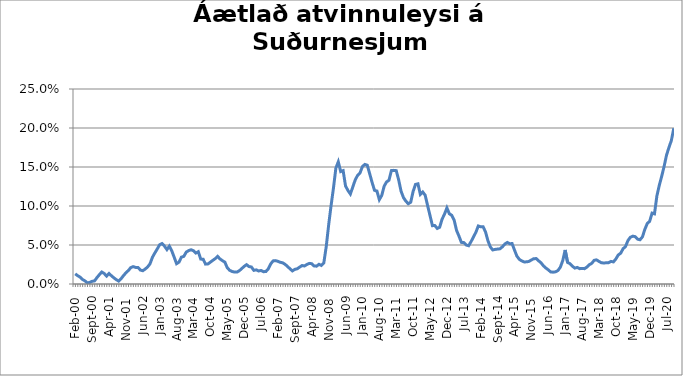
| Category | Series 0 |
|---|---|
| feb.00 | 0.013 |
| mar.00 | 0.011 |
| apr.00 | 0.009 |
| maí.00 | 0.006 |
| jún.00 | 0.004 |
| júl.00 | 0.002 |
| ágú.00 | 0.002 |
| sep.00 | 0.003 |
| okt.00 | 0.004 |
| nóv.00 | 0.008 |
| des.00 | 0.012 |
| jan.01 | 0.015 |
| feb.01 | 0.013 |
| mar.01 | 0.01 |
| apr.01 | 0.013 |
| maí.01 | 0.011 |
| jún.01 | 0.008 |
| júl.01 | 0.006 |
| ágú.01 | 0.004 |
| sep.01 | 0.007 |
| okt.01 | 0.011 |
| nóv.01 | 0.014 |
| des.01 | 0.017 |
| jan.02 | 0.021 |
| feb.02 | 0.022 |
| mar.02 | 0.021 |
| apr.02 | 0.021 |
| maí.02 | 0.018 |
| jún.02 | 0.017 |
| júl.02 | 0.019 |
| ágú.02 | 0.022 |
| sep.02 | 0.026 |
| okt.02 | 0.034 |
| nóv.02 | 0.04 |
| des.02 | 0.045 |
| jan.03 | 0.05 |
| feb.03 | 0.052 |
| mar.03 | 0.049 |
| apr.03 | 0.044 |
| maí.03 | 0.049 |
| jún.03 | 0.043 |
| júl.03 | 0.034 |
| ágú.03 | 0.026 |
| sep.03 | 0.028 |
| okt.03 | 0.034 |
| nóv.03 | 0.035 |
| des.03 | 0.041 |
| jan.04 | 0.043 |
| feb.04 | 0.044 |
| mar.04 | 0.043 |
| apr.04 | 0.04 |
| maí.04 | 0.041 |
| jún.04 | 0.032 |
| júl.04 | 0.032 |
| ágú.04 | 0.026 |
| sep.04 | 0.026 |
| okt.04 | 0.028 |
| nóv.04 | 0.03 |
| des.04 | 0.032 |
| jan.05 | 0.035 |
| feb.05 | 0.032 |
| mar.05 | 0.03 |
| apr.05 | 0.028 |
| maí.05 | 0.021 |
| jún.05 | 0.018 |
| júl.05 | 0.016 |
| ágú.05 | 0.015 |
| sep.05 | 0.015 |
| okt.05 | 0.017 |
| nóv.05 | 0.02 |
| des.05 | 0.023 |
| jan.06 | 0.025 |
| feb.06 | 0.022 |
| mar.06 | 0.022 |
| apr.06 | 0.018 |
| maí.06 | 0.018 |
| jún.06 | 0.017 |
| júl.06 | 0.017 |
| ágú.06 | 0.016 |
| sep.06 | 0.016 |
| okt.06 | 0.019 |
| nóv.06 | 0.026 |
| des.06 | 0.03 |
| jan.07 | 0.03 |
| feb.07 | 0.029 |
| mar.07 | 0.028 |
| apr.07 | 0.027 |
| maí.07 | 0.025 |
| jún.07 | 0.022 |
| júl.07 | 0.019 |
| ágú.07 | 0.017 |
| sep.07 | 0.019 |
| okt.07 | 0.02 |
| nóv.07 | 0.022 |
| des.07 | 0.024 |
| jan.08 | 0.023 |
| feb.08 | 0.025 |
| mar.08 | 0.026 |
| apr.08 | 0.026 |
| maí.08 | 0.023 |
| jún.08 | 0.023 |
| júl.08 | 0.025 |
| ágú.08 | 0.024 |
| sep.08 | 0.027 |
| okt.08 | 0.048 |
| nóv.08 | 0.075 |
| des.08 | 0.1 |
| jan.09 | 0.123 |
| feb.09 | 0.149 |
| mar.09 | 0.157 |
| apr.09 | 0.144 |
| maí.09 | 0.145 |
| jún.09 | 0.126 |
| júl.09 | 0.12 |
| ágú.09 | 0.115 |
| sep.09 | 0.124 |
| okt.09 | 0.133 |
| nóv.09 | 0.139 |
| des.09 | 0.142 |
| jan.10 | 0.151 |
| feb.10 | 0.153 |
| mar.10 | 0.152 |
| apr.10 | 0.141 |
| maí.10 | 0.13 |
| jún.10 | 0.12 |
| júl.10 | 0.119 |
| ágú.10 | 0.108 |
| sep.10 | 0.114 |
| okt.10 | 0.125 |
| nóv.10 | 0.131 |
| des.10 | 0.133 |
| jan.11 | 0.145 |
| feb.11 | 0.146 |
| mar.11 | 0.145 |
| apr.11 | 0.134 |
| maí.11 | 0.119 |
| jún.11 | 0.111 |
| júl.11 | 0.106 |
| ágú.11 | 0.103 |
| sep.11 | 0.105 |
| okt.11 | 0.119 |
| nóv.11 | 0.128 |
| des.11 | 0.128 |
| jan.12 | 0.115 |
| feb.12 | 0.118 |
| mar.12 | 0.114 |
| apr.12 | 0.101 |
| maí.12 | 0.088 |
| jún.12 | 0.075 |
| júl.12 | 0.075 |
| ágú.12 | 0.071 |
| sep.12 | 0.073 |
| okt.12 | 0.083 |
| nóv.12 | 0.09 |
| des.12 | 0.098 |
| jan.13 | 0.09 |
| feb.13 | 0.088 |
| mar.13 | 0.082 |
| apr.13 | 0.069 |
| maí.13 | 0.061 |
| jún.13 | 0.053 |
| júl.13 | 0.053 |
| ágú.13 | 0.05 |
| sep.13 | 0.049 |
| okt.13 | 0.054 |
| nóv.13 | 0.06 |
| des.13 | 0.066 |
| jan.14 | 0.074 |
| feb.14 | 0.073 |
| mar.14 | 0.073 |
| apr.14 | 0.067 |
| maí.14 | 0.055 |
| jún.14 | 0.048 |
| júl.14 | 0.044 |
| ágú.14 | 0.044 |
| sep.14 | 0.045 |
| okt.14 | 0.045 |
| nóv.14*** | 0.048 |
| des.14 | 0.051 |
| jan.15 | 0.053 |
| feb.15 | 0.052 |
| mar.15 | 0.052 |
| apr.15 | 0.044 |
| maí.15 | 0.036 |
| jún.15 | 0.032 |
| júl.15 | 0.03 |
| ágú.15 | 0.028 |
| sep.15 | 0.028 |
| okt.15 | 0.029 |
| nóv.15 | 0.031 |
| des.15 | 0.032 |
| jan.16 | 0.033 |
| feb.16 | 0.03 |
| mar.16 | 0.027 |
| apr.16 | 0.023 |
| maí.16 | 0.02 |
| jún.16 | 0.018 |
| júl.16 | 0.015 |
| ágú.16 | 0.015 |
| sep.16 | 0.016 |
| okt.16 | 0.017 |
| nóv.16 | 0.022 |
| des.16 | 0.03 |
| jan.17 | 0.044 |
| feb.17 | 0.028 |
| mar.17 | 0.026 |
| apr.17 | 0.023 |
| maí.17 | 0.02 |
| jún.17 | 0.021 |
| júl.17 | 0.02 |
| ágú.17 | 0.02 |
| sep.17 | 0.02 |
| okt.17 | 0.022 |
| nóv.17 | 0.025 |
| des.17 | 0.026 |
| jan.18 | 0.03 |
| feb.18 | 0.031 |
| mar.18 | 0.029 |
| apr.18 | 0.027 |
| maí.18 | 0.027 |
| jún.18 | 0.027 |
| júl.18 | 0.027 |
| ágú.18 | 0.029 |
| sep.18 | 0.028 |
| okt.18 | 0.032 |
| nóv.18 | 0.037 |
| des.18 | 0.039 |
| jan.19 | 0.045 |
| feb.19 | 0.048 |
| mar.19 | 0.056 |
| apr.19 | 0.06 |
| maí.19 | 0.061 |
| jún.19 | 0.061 |
| júl.19 | 0.057 |
| ágú.19 | 0.057 |
| sep.19 | 0.06 |
| okt.19 | 0.07 |
| nóv.19 | 0.078 |
| des.19 | 0.08 |
| jan.20 | 0.091 |
| feb.20 | 0.09 |
| mars 2020* | 0.113 |
| apr.20 | 0.127 |
| maí.20 | 0.138 |
| jún.20 | 0.151 |
| júl.20 | 0.165 |
| ágú.20 | 0.175 |
| sep.20 | 0.184 |
| okt.20 | 0.2 |